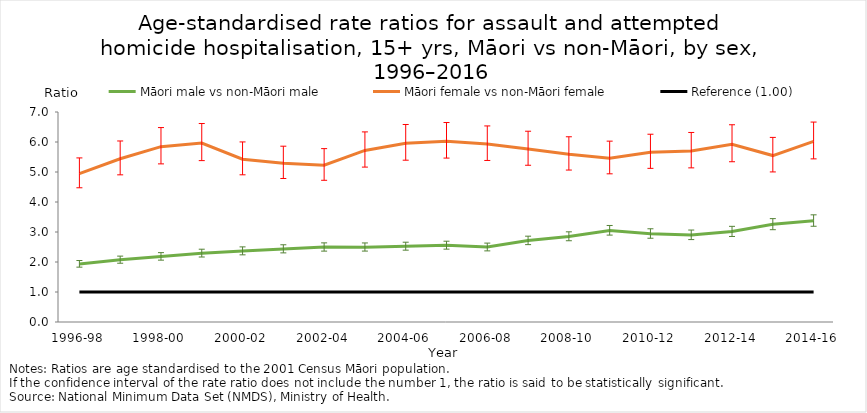
| Category | Māori male vs non-Māori male | Māori female vs non-Māori female | Reference (1.00) |
|---|---|---|---|
| 1996-98 | 1.935 | 4.947 | 1 |
| 1997-99 | 2.074 | 5.441 | 1 |
| 1998-00 | 2.183 | 5.845 | 1 |
| 1999-01 | 2.293 | 5.966 | 1 |
| 2000-02 | 2.368 | 5.427 | 1 |
| 2001-03 | 2.435 | 5.295 | 1 |
| 2002-04 | 2.496 | 5.225 | 1 |
| 2003-05 | 2.496 | 5.72 | 1 |
| 2004-06 | 2.524 | 5.959 | 1 |
| 2005-07 | 2.557 | 6.028 | 1 |
| 2006-08 | 2.497 | 5.932 | 1 |
| 2007-09 | 2.716 | 5.764 | 1 |
| 2008-10 | 2.854 | 5.592 | 1 |
| 2009-11 | 3.053 | 5.457 | 1 |
| 2010-12 | 2.946 | 5.662 | 1 |
| 2011-13 | 2.902 | 5.697 | 1 |
| 2012-14 | 3.015 | 5.926 | 1 |
| 2013-15 | 3.256 | 5.548 | 1 |
| 2014-16 | 3.377 | 6.02 | 1 |